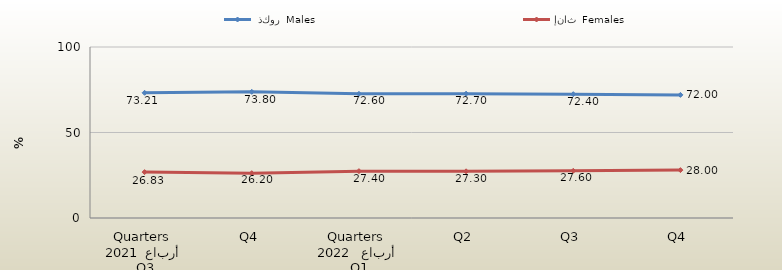
| Category |  ذكور  Males | إناث  Females |
|---|---|---|
| 0 | 73.206 | 26.833 |
| 1 | 73.8 | 26.2 |
| 2 | 72.6 | 27.4 |
| 3 | 72.7 | 27.3 |
| 4 | 72.4 | 27.6 |
| 5 | 72 | 28 |